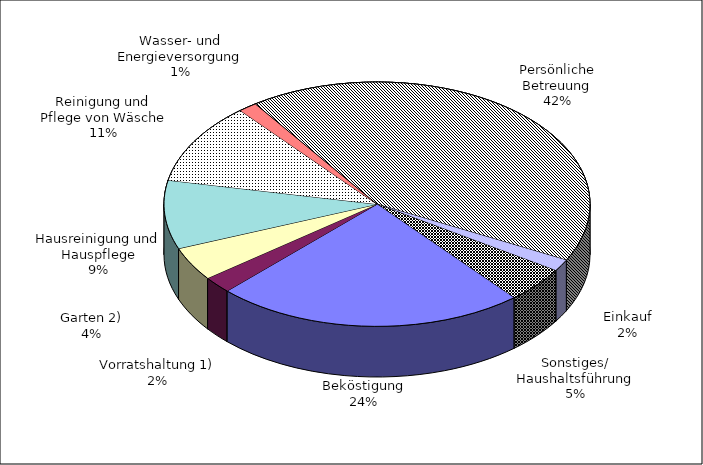
| Category | Series 0 |
|---|---|
| Beköstigung | 1494 |
| Vorratshaltung 1) | 141 |
| Garten 2) | 282 |
| Hausreinigung und Hauspflege | 576 |
| Reinigung und Pflege von Wäsche | 683 |
| Wasser- und Energieversorgung | 90 |
| Persönliche Betreuung | 2683 |
| Einkauf | 100 |
| Sonstiges/ Haushaltsführung | 301 |